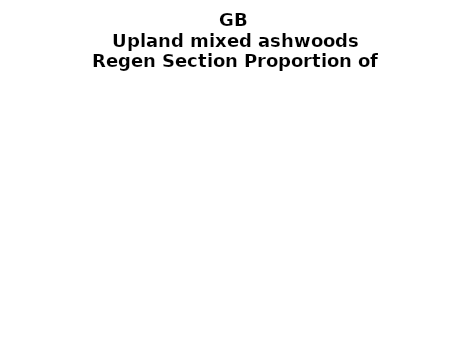
| Category | Upland mixed ashwoods |
|---|---|
| None | 0.072 |
| Seedlings only | 0 |
| Seedlings, saplings only | 0.028 |
| Seedlings, saplings, <7 cm trees | 0.191 |
| Saplings only | 0.189 |
| <7 cm trees, seedlings only | 0 |
| <7 cm trees, saplings only | 0.431 |
| <7 cm Trees only | 0.089 |